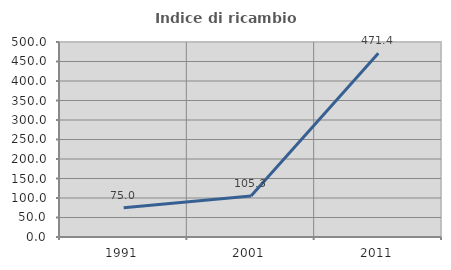
| Category | Indice di ricambio occupazionale  |
|---|---|
| 1991.0 | 75 |
| 2001.0 | 105.263 |
| 2011.0 | 471.429 |